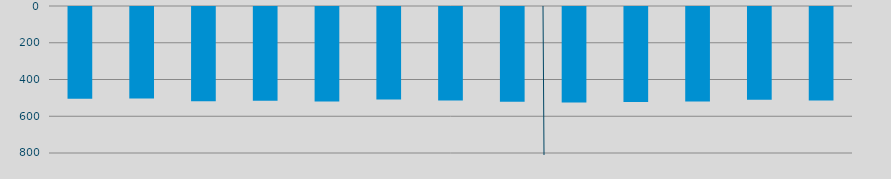
| Category | Energía a bajar | Energía a subir |
|---|---|---|
| M | 499.501 |  |
| J | 497.646 |  |
| J | 513.091 |  |
| A | 509.948 |  |
| S | 514.59 |  |
| O | 502.757 |  |
| N | 509.389 |  |
| D | 515.349 |  |
| E | 520.032 |  |
| F | 516.897 |  |
| M | 513.61 |  |
| A | 504.985 |  |
| M | 508.805 |  |